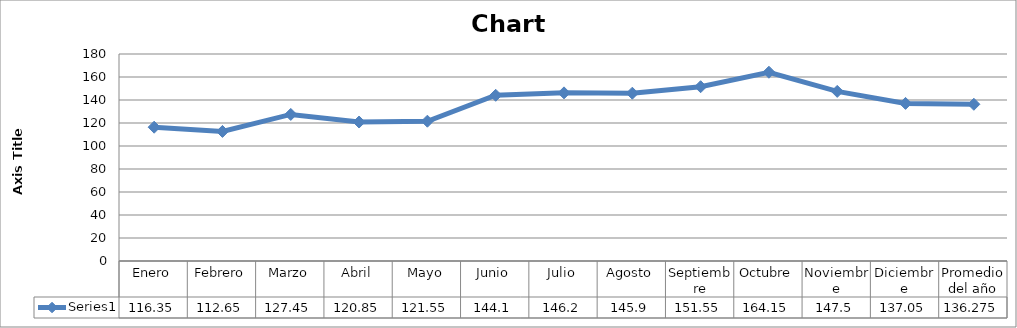
| Category | Series 0 |
|---|---|
| Enero | 116.35 |
| Febrero | 112.65 |
| Marzo | 127.45 |
| Abril | 120.85 |
| Mayo | 121.55 |
| Junio | 144.1 |
| Julio | 146.2 |
| Agosto | 145.9 |
| Septiembre | 151.55 |
| Octubre | 164.15 |
| Noviembre | 147.5 |
| Diciembre | 137.05 |
| Promedio del año | 136.275 |